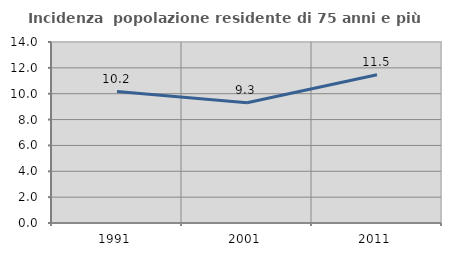
| Category | Incidenza  popolazione residente di 75 anni e più |
|---|---|
| 1991.0 | 10.167 |
| 2001.0 | 9.305 |
| 2011.0 | 11.463 |